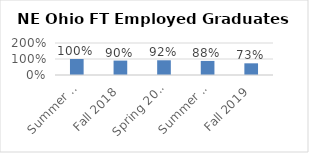
| Category | Series 0 |
|---|---|
| Summer 2018 | 1 |
| Fall 2018 | 0.9 |
| Spring 2019 | 0.92 |
| Summer 2019 | 0.88 |
| Fall 2019 | 0.73 |